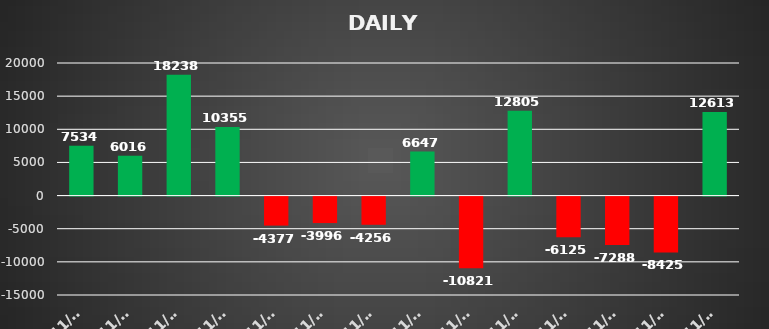
| Category | Series 0 |
|---|---|
| 2021-11-01 | 7533.69 |
| 2021-11-03 | 6015.6 |
| 2021-11-08 | 18237.798 |
| 2021-11-09 | 10354.508 |
| 2021-11-10 | -4377.312 |
| 2021-11-12 | -3995.662 |
| 2021-11-15 | -4256.145 |
| 2021-11-16 | 6647.1 |
| 2021-11-17 | -10821.195 |
| 2021-11-23 | 12805 |
| 2021-11-24 | -6125.46 |
| 2021-11-25 | -7288.3 |
| 2021-11-29 | -8425.26 |
| 2021-11-30 | 12613.137 |